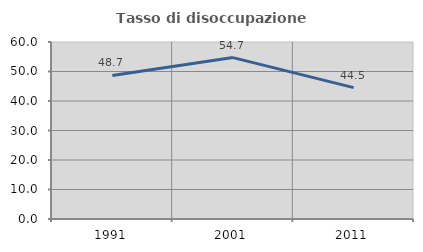
| Category | Tasso di disoccupazione giovanile  |
|---|---|
| 1991.0 | 48.665 |
| 2001.0 | 54.717 |
| 2011.0 | 44.531 |